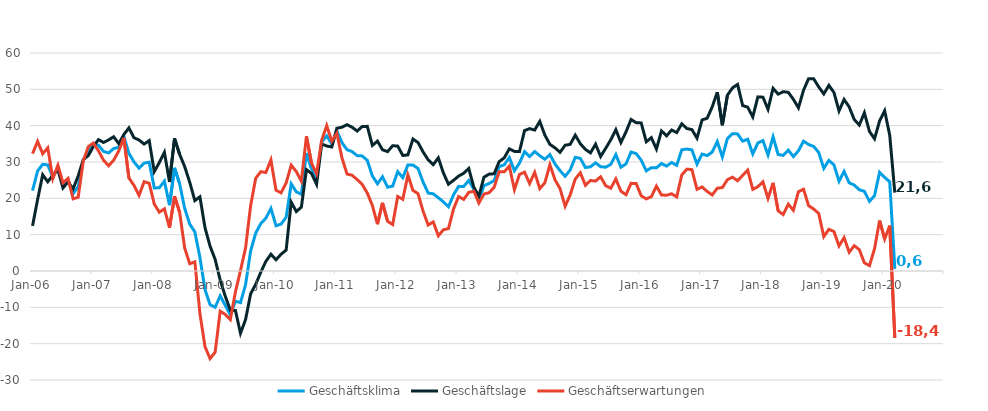
| Category | Geschäftsklima | Geschäftslage | Geschäftserwartungen |
|---|---|---|---|
| 2006-01-01 | 22.132 | 12.415 | 32.294 |
| 2006-02-01 | 27.533 | 19.672 | 35.676 |
| 2006-03-01 | 29.358 | 26.492 | 32.26 |
| 2006-04-01 | 29.177 | 24.557 | 33.892 |
| 2006-05-01 | 25.879 | 26.333 | 25.426 |
| 2006-06-01 | 28.517 | 27.929 | 29.106 |
| 2006-07-01 | 23.551 | 22.842 | 24.262 |
| 2006-08-01 | 25.015 | 24.537 | 25.495 |
| 2006-09-01 | 21.243 | 22.621 | 19.874 |
| 2006-10-01 | 23.196 | 26.148 | 20.283 |
| 2006-11-01 | 30.468 | 30.64 | 30.297 |
| 2006-12-01 | 33.004 | 31.773 | 34.242 |
| 2007-01-01 | 34.754 | 34.299 | 35.21 |
| 2007-02-01 | 34.603 | 36.156 | 33.06 |
| 2007-03-01 | 32.919 | 35.37 | 30.493 |
| 2007-04-01 | 32.494 | 36.074 | 28.967 |
| 2007-05-01 | 33.707 | 36.946 | 30.513 |
| 2007-06-01 | 34.042 | 35.043 | 33.045 |
| 2007-07-01 | 37.091 | 37.55 | 36.633 |
| 2007-08-01 | 32.387 | 39.387 | 25.592 |
| 2007-09-01 | 30.029 | 36.679 | 23.565 |
| 2007-10-01 | 28.306 | 36.052 | 20.815 |
| 2007-11-01 | 29.698 | 34.939 | 24.574 |
| 2007-12-01 | 29.94 | 35.886 | 24.144 |
| 2008-01-01 | 22.849 | 27.363 | 18.425 |
| 2008-02-01 | 22.912 | 29.852 | 16.182 |
| 2008-03-01 | 24.744 | 32.66 | 17.097 |
| 2008-04-01 | 18.125 | 24.504 | 11.928 |
| 2008-05-01 | 28.387 | 36.476 | 20.575 |
| 2008-06-01 | 23.975 | 32.099 | 16.135 |
| 2008-07-01 | 17.207 | 28.722 | 6.271 |
| 2008-08-01 | 12.897 | 24.38 | 2.002 |
| 2008-09-01 | 10.77 | 19.37 | 2.507 |
| 2008-10-01 | 3.726 | 20.423 | -11.707 |
| 2008-11-01 | -5.133 | 11.933 | -20.824 |
| 2008-12-01 | -9.264 | 6.829 | -24.105 |
| 2009-01-01 | -9.993 | 3.208 | -22.335 |
| 2009-02-01 | -6.838 | -2.525 | -11.057 |
| 2009-03-01 | -9.475 | -6.959 | -11.958 |
| 2009-04-01 | -12.101 | -10.836 | -13.358 |
| 2009-05-01 | -8.31 | -10.847 | -5.74 |
| 2009-06-01 | -8.7 | -17.138 | 0.128 |
| 2009-07-01 | -3.756 | -13.368 | 6.351 |
| 2009-08-01 | 5.516 | -6.268 | 18.018 |
| 2009-09-01 | 10.433 | -3.668 | 25.546 |
| 2009-10-01 | 13.05 | -0.33 | 27.326 |
| 2009-11-01 | 14.533 | 2.646 | 27.118 |
| 2009-12-01 | 17.216 | 4.623 | 30.584 |
| 2010-01-01 | 12.444 | 3.089 | 22.229 |
| 2010-02-01 | 12.9 | 4.614 | 21.521 |
| 2010-03-01 | 14.793 | 5.752 | 24.232 |
| 2010-04-01 | 23.98 | 18.954 | 29.12 |
| 2010-05-01 | 21.799 | 16.362 | 27.372 |
| 2010-06-01 | 21.125 | 17.585 | 24.722 |
| 2010-07-01 | 32.437 | 27.896 | 37.069 |
| 2010-08-01 | 28.264 | 26.845 | 29.691 |
| 2010-09-01 | 25.308 | 23.862 | 26.762 |
| 2010-10-01 | 35.479 | 34.97 | 35.988 |
| 2010-11-01 | 37.183 | 34.397 | 40.003 |
| 2010-12-01 | 34.946 | 34.142 | 35.752 |
| 2011-01-01 | 38.581 | 39.282 | 37.882 |
| 2011-02-01 | 35.323 | 39.572 | 31.15 |
| 2011-03-01 | 33.379 | 40.262 | 26.694 |
| 2011-04-01 | 32.863 | 39.558 | 26.355 |
| 2011-05-01 | 31.747 | 38.517 | 25.17 |
| 2011-06-01 | 31.668 | 39.779 | 23.831 |
| 2011-07-01 | 30.446 | 39.808 | 21.45 |
| 2011-08-01 | 26.147 | 34.559 | 18.037 |
| 2011-09-01 | 24.019 | 35.74 | 12.881 |
| 2011-10-01 | 25.932 | 33.353 | 18.746 |
| 2011-11-01 | 23.066 | 32.856 | 13.687 |
| 2011-12-01 | 23.376 | 34.489 | 12.789 |
| 2012-01-01 | 27.341 | 34.376 | 20.516 |
| 2012-02-01 | 25.683 | 31.789 | 19.737 |
| 2012-03-01 | 29.165 | 31.955 | 26.407 |
| 2012-04-01 | 29.142 | 36.317 | 22.185 |
| 2012-05-01 | 28.214 | 35.357 | 21.288 |
| 2012-06-01 | 24.461 | 32.761 | 16.457 |
| 2012-07-01 | 21.454 | 30.602 | 12.67 |
| 2012-08-01 | 21.249 | 29.269 | 13.509 |
| 2012-09-01 | 20.156 | 31.142 | 9.693 |
| 2012-10-01 | 19.034 | 27.001 | 11.347 |
| 2012-11-01 | 17.689 | 23.887 | 11.664 |
| 2012-12-01 | 20.982 | 24.963 | 17.07 |
| 2013-01-01 | 23.292 | 26.124 | 20.497 |
| 2013-02-01 | 23.269 | 26.895 | 19.701 |
| 2013-03-01 | 24.904 | 28.215 | 21.64 |
| 2013-04-01 | 22.517 | 23.06 | 21.974 |
| 2013-05-01 | 19.663 | 20.625 | 18.705 |
| 2013-06-01 | 23.489 | 25.811 | 21.191 |
| 2013-07-01 | 24.086 | 26.664 | 21.538 |
| 2013-08-01 | 24.872 | 26.757 | 23.002 |
| 2013-09-01 | 28.726 | 30.111 | 27.349 |
| 2013-10-01 | 29.218 | 31.151 | 27.301 |
| 2013-11-01 | 31.238 | 33.625 | 28.876 |
| 2013-12-01 | 27.597 | 32.926 | 22.389 |
| 2014-01-01 | 29.688 | 32.862 | 26.558 |
| 2014-02-01 | 32.855 | 38.642 | 27.208 |
| 2014-03-01 | 31.511 | 39.187 | 24.082 |
| 2014-04-01 | 32.892 | 38.789 | 27.141 |
| 2014-05-01 | 31.737 | 41.179 | 22.665 |
| 2014-06-01 | 30.755 | 37.431 | 24.268 |
| 2014-07-01 | 32.033 | 34.85 | 29.251 |
| 2014-08-01 | 29.458 | 33.892 | 25.109 |
| 2014-09-01 | 27.624 | 32.671 | 22.687 |
| 2014-10-01 | 26.06 | 34.607 | 17.824 |
| 2014-11-01 | 27.804 | 34.853 | 20.967 |
| 2014-12-01 | 31.281 | 37.392 | 25.327 |
| 2015-01-01 | 30.992 | 35.022 | 27.031 |
| 2015-02-01 | 28.477 | 33.472 | 23.588 |
| 2015-03-01 | 28.685 | 32.513 | 24.92 |
| 2015-04-01 | 29.776 | 34.906 | 24.759 |
| 2015-05-01 | 28.707 | 31.526 | 25.922 |
| 2015-06-01 | 28.572 | 33.778 | 23.482 |
| 2015-07-01 | 29.351 | 36.111 | 22.784 |
| 2015-08-01 | 32.025 | 38.91 | 25.339 |
| 2015-09-01 | 28.564 | 35.362 | 21.962 |
| 2015-10-01 | 29.479 | 38.289 | 20.995 |
| 2015-11-01 | 32.749 | 41.707 | 24.123 |
| 2015-12-01 | 32.314 | 40.83 | 24.098 |
| 2016-01-01 | 30.506 | 40.755 | 20.694 |
| 2016-02-01 | 27.569 | 35.568 | 19.841 |
| 2016-03-01 | 28.437 | 36.702 | 20.461 |
| 2016-04-01 | 28.407 | 33.578 | 23.35 |
| 2016-05-01 | 29.569 | 38.564 | 20.913 |
| 2016-06-01 | 28.88 | 37.194 | 20.858 |
| 2016-07-01 | 29.864 | 38.806 | 21.256 |
| 2016-08-01 | 29.078 | 38.102 | 20.395 |
| 2016-09-01 | 33.363 | 40.504 | 26.434 |
| 2016-10-01 | 33.561 | 39.215 | 28.04 |
| 2016-11-01 | 33.338 | 38.913 | 27.893 |
| 2016-12-01 | 29.409 | 36.564 | 22.47 |
| 2017-01-01 | 32.186 | 41.586 | 23.152 |
| 2017-02-01 | 31.757 | 42.049 | 21.902 |
| 2017-03-01 | 32.736 | 45.172 | 20.93 |
| 2017-04-01 | 35.624 | 49.207 | 22.781 |
| 2017-05-01 | 31.385 | 40.12 | 22.968 |
| 2017-06-01 | 36.477 | 48.389 | 25.136 |
| 2017-07-01 | 37.803 | 50.404 | 25.837 |
| 2017-08-01 | 37.724 | 51.355 | 24.833 |
| 2017-09-01 | 35.735 | 45.55 | 26.312 |
| 2017-10-01 | 36.262 | 45.072 | 27.768 |
| 2017-11-01 | 32.224 | 42.404 | 22.471 |
| 2017-12-01 | 35.236 | 47.916 | 23.204 |
| 2018-01-01 | 35.897 | 47.843 | 24.527 |
| 2018-02-01 | 31.924 | 44.51 | 19.986 |
| 2018-03-01 | 36.912 | 50.274 | 24.263 |
| 2018-04-01 | 32.059 | 48.67 | 16.558 |
| 2018-05-01 | 31.831 | 49.358 | 15.537 |
| 2018-06-01 | 33.278 | 49.171 | 18.398 |
| 2018-07-01 | 31.479 | 47.253 | 16.711 |
| 2018-08-01 | 33.09 | 44.915 | 21.836 |
| 2018-09-01 | 35.729 | 49.739 | 22.505 |
| 2018-10-01 | 34.814 | 52.939 | 17.989 |
| 2018-11-01 | 34.294 | 52.9 | 17.058 |
| 2018-12-01 | 32.594 | 50.659 | 15.832 |
| 2019-01-01 | 28.251 | 48.738 | 9.452 |
| 2019-02-01 | 30.436 | 51.1 | 11.474 |
| 2019-03-01 | 29.206 | 49.139 | 10.869 |
| 2019-04-01 | 24.71 | 44.059 | 6.895 |
| 2019-05-01 | 27.404 | 47.215 | 9.181 |
| 2019-06-01 | 24.266 | 45.157 | 5.154 |
| 2019-07-01 | 23.657 | 41.696 | 6.963 |
| 2019-08-01 | 22.357 | 40.168 | 5.867 |
| 2019-09-01 | 21.935 | 43.552 | 2.237 |
| 2019-10-01 | 19.167 | 38.419 | 1.47 |
| 2019-11-01 | 20.732 | 36.396 | 6.106 |
| 2019-12-01 | 27.181 | 41.302 | 13.886 |
| 2020-01-01 | 25.757 | 44.08 | 8.81 |
| 2020-02-01 | 24.567 | 37.332 | 12.489 |
| 2020-03-01 | 0.582 | 21.579 | -18.424 |